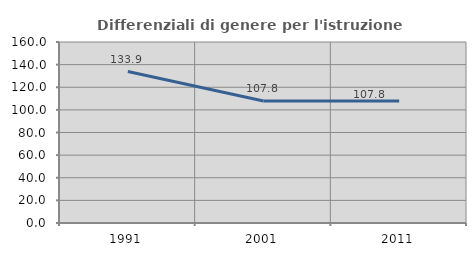
| Category | Differenziali di genere per l'istruzione superiore |
|---|---|
| 1991.0 | 133.883 |
| 2001.0 | 107.838 |
| 2011.0 | 107.783 |